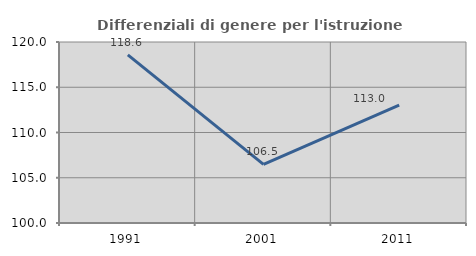
| Category | Differenziali di genere per l'istruzione superiore |
|---|---|
| 1991.0 | 118.584 |
| 2001.0 | 106.482 |
| 2011.0 | 113.018 |